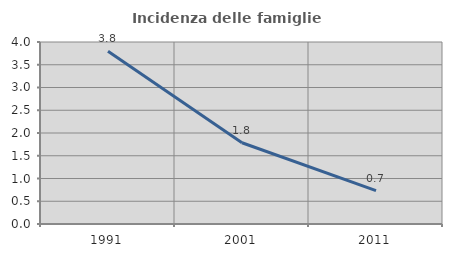
| Category | Incidenza delle famiglie numerose |
|---|---|
| 1991.0 | 3.797 |
| 2001.0 | 1.786 |
| 2011.0 | 0.735 |